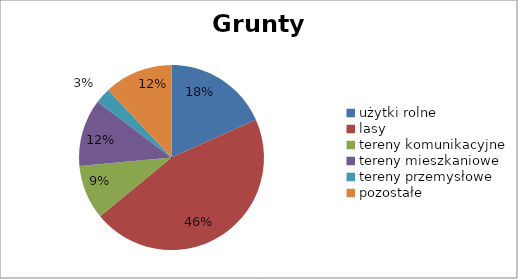
| Category | Series 0 | Series 1 |
|---|---|---|
| użytki rolne | 2478 | 0.183 |
| lasy | 6198 | 0.457 |
| tereny komunikacyjne | 1285 | 0.095 |
| tereny mieszkaniowe | 1594 | 0.118 |
| tereny przemysłowe | 370 | 0.027 |
| pozostałe | 1624 | 0.12 |